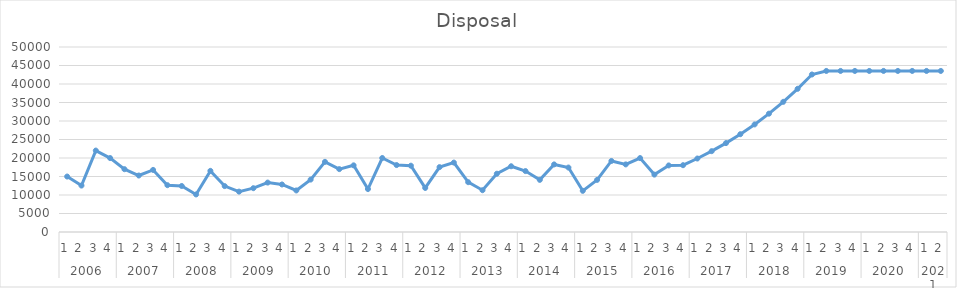
| Category | Disposal |
|---|---|
| 0 | 14989 |
| 1 | 12550 |
| 2 | 22009 |
| 3 | 19980 |
| 4 | 16976 |
| 5 | 15265 |
| 6 | 16781 |
| 7 | 12655 |
| 8 | 12435 |
| 9 | 10153 |
| 10 | 16525 |
| 11 | 12406 |
| 12 | 10913 |
| 13 | 11842 |
| 14 | 13359 |
| 15 | 12844 |
| 16 | 11228 |
| 17 | 14168 |
| 18 | 18960 |
| 19 | 16997 |
| 20 | 18014 |
| 21 | 11617 |
| 22 | 19996 |
| 23 | 18095 |
| 24 | 17921 |
| 25 | 11910 |
| 26 | 17538 |
| 27 | 18762 |
| 28 | 13464 |
| 29 | 11296 |
| 30 | 15746 |
| 31 | 17772 |
| 32 | 16468 |
| 33 | 14087 |
| 34 | 18264 |
| 35 | 17420 |
| 36 | 11128 |
| 37 | 14087 |
| 38 | 19198 |
| 39 | 18267 |
| 40 | 19983 |
| 41 | 15513 |
| 42 | 17991 |
| 43 | 18054.398 |
| 44 | 19859.838 |
| 45 | 21845.821 |
| 46 | 24030.404 |
| 47 | 26433.444 |
| 48 | 29076.788 |
| 49 | 31984.467 |
| 50 | 35182.914 |
| 51 | 38701.205 |
| 52 | 42571.326 |
| 53 | 43530.366 |
| 54 | 43530.366 |
| 55 | 43530.366 |
| 56 | 43530.366 |
| 57 | 43530.366 |
| 58 | 43530.366 |
| 59 | 43530.366 |
| 60 | 43530.366 |
| 61 | 43530.366 |